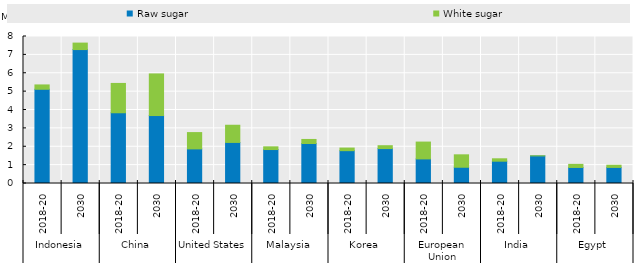
| Category | Raw sugar | White sugar |
|---|---|---|
| 0 | 5.128 | 0.236 |
| 1 | 7.289 | 0.352 |
| 2 | 3.85 | 1.596 |
| 3 | 3.698 | 2.265 |
| 4 | 1.883 | 0.888 |
| 5 | 2.235 | 0.935 |
| 6 | 1.848 | 0.147 |
| 7 | 2.177 | 0.22 |
| 8 | 1.787 | 0.142 |
| 9 | 1.9 | 0.156 |
| 10 | 1.338 | 0.917 |
| 11 | 0.885 | 0.676 |
| 12 | 1.214 | 0.13 |
| 13 | 1.503 | 0.003 |
| 14 | 0.873 | 0.168 |
| 15 | 0.876 | 0.118 |